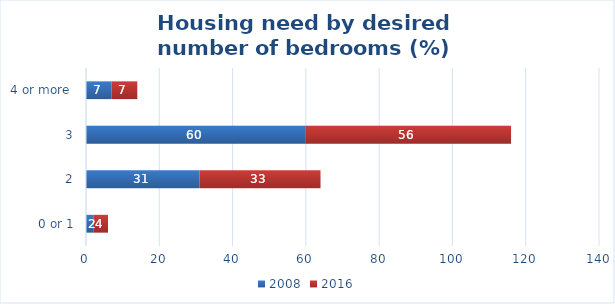
| Category | 2008 | 2016 |
|---|---|---|
| 0 or 1 | 2 | 4 |
| 2 | 31 | 33 |
| 3 | 60 | 56 |
| 4 or more  | 7 | 7 |